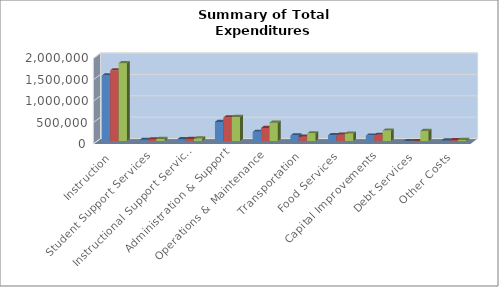
| Category | 2016-2017 | 2017-2018 | 2018-2019 |
|---|---|---|---|
| Instruction | 1533442 | 1653406 | 1820880 |
| Student Support Services | 28771 | 40478 | 48355 |
| Instructional Support Services | 43910 | 51152 | 60055 |
| Administration & Support | 448750 | 551389 | 564914 |
| Operations & Maintenance | 216034 | 306601 | 431080 |
| Transportation | 129797 | 102056 | 180855 |
| Food Services | 137766 | 150559 | 174838 |
| Capital Improvements | 128161 | 145941 | 245941 |
| Debt Services | 0 | 0 | 235422 |
| Other Costs | 14058 | 20446 | 27788 |